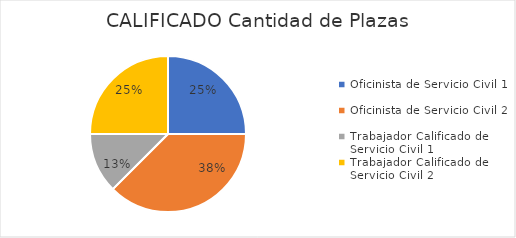
| Category | CALIFICADO |
|---|---|
| Oficinista de Servicio Civil 1 | 2 |
| Oficinista de Servicio Civil 2 | 3 |
| Trabajador Calificado de Servicio Civil 1 | 1 |
| Trabajador Calificado de Servicio Civil 2 | 2 |